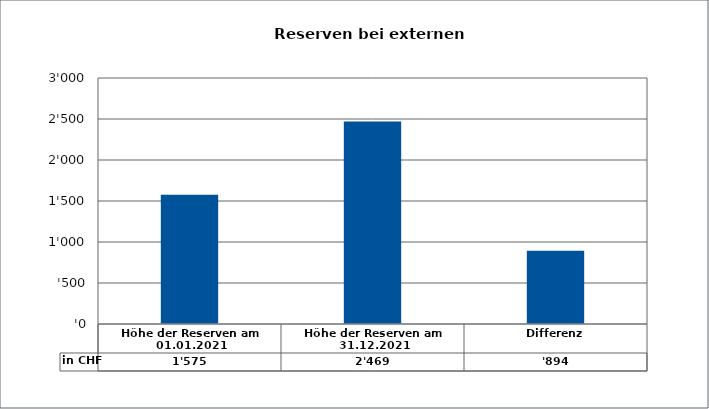
| Category | in CHF |
|---|---|
| Höhe der Reserven am 01.01.2021 | 1575 |
| Höhe der Reserven am 31.12.2021 | 2469 |
| Differenz | 894 |